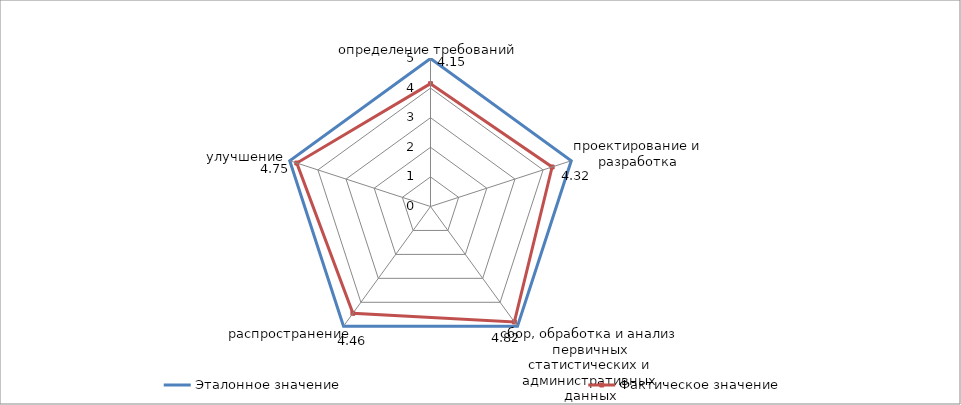
| Category | Эталонное значение | Фактическое значение |
|---|---|---|
| определение требований | 5 | 4.15 |
| проектирование и разработка | 5 | 4.32 |
| сбор, обработка и анализ первичных статистических и административных данных | 5 | 4.82 |
| распространение | 5 | 4.46 |
| улучшение | 5 | 4.75 |